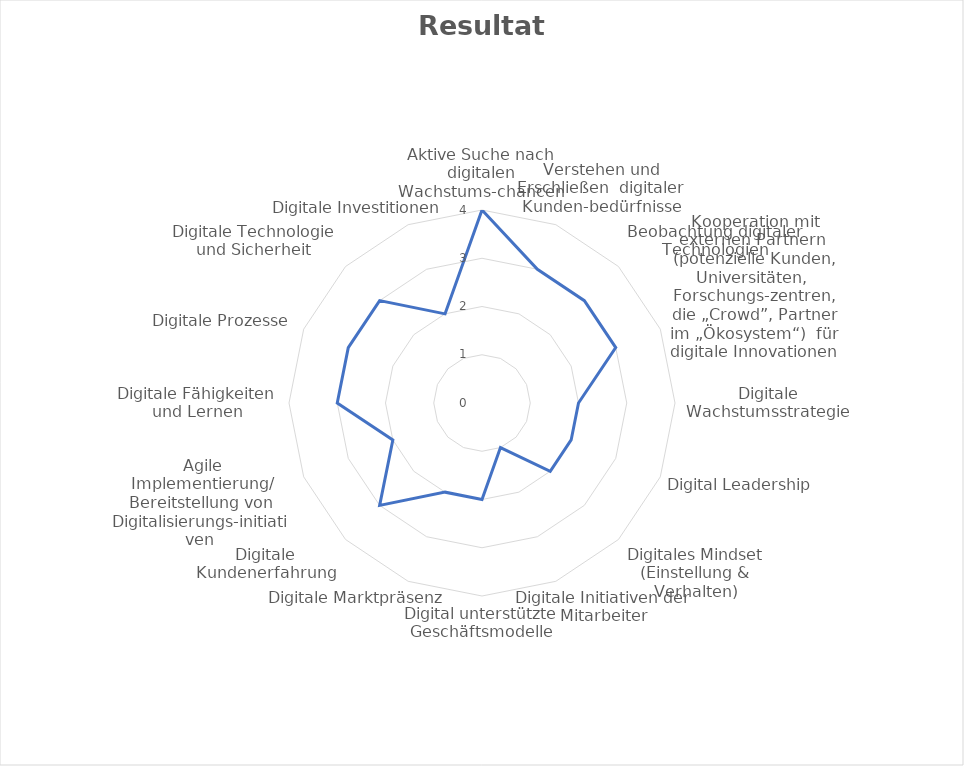
| Category | Series 0 |
|---|---|
| Aktive Suche nach digitalen Wachstums-chancen | 4 |
| Verstehen und Erschließen  digitaler Kunden-bedürfnisse | 3 |
| Beobachtung digitaler Technologien | 3 |
| Kooperation mit externen Partnern 
(potenzielle Kunden, Universitäten,  Forschungs-zentren, die „Crowd”, Partner im „Ökosystem“)  für digitale Innovationen | 3 |
| Digitale Wachstumsstrategie | 2 |
| Digital Leadership | 2 |
| Digitales Mindset (Einstellung & Verhalten) | 2 |
| Digitale Initiativen der Mitarbeiter | 1 |
| Digital unterstützte Geschäftsmodelle | 2 |
| Digitale Marktpräsenz | 2 |
| Digitale Kundenerfahrung | 3 |
| Agile Implementierung/ Bereitstellung von Digitalisierungs-initiativen  | 2 |
| Digitale Fähigkeiten und Lernen | 3 |
| Digitale Prozesse | 3 |
| Digitale Technologie und Sicherheit | 3 |
| Digitale Investitionen | 2 |